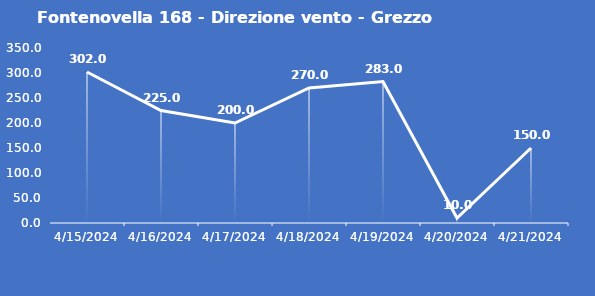
| Category | Fontenovella 168 - Direzione vento - Grezzo (°N) |
|---|---|
| 4/15/24 | 302 |
| 4/16/24 | 225 |
| 4/17/24 | 200 |
| 4/18/24 | 270 |
| 4/19/24 | 283 |
| 4/20/24 | 10 |
| 4/21/24 | 150 |